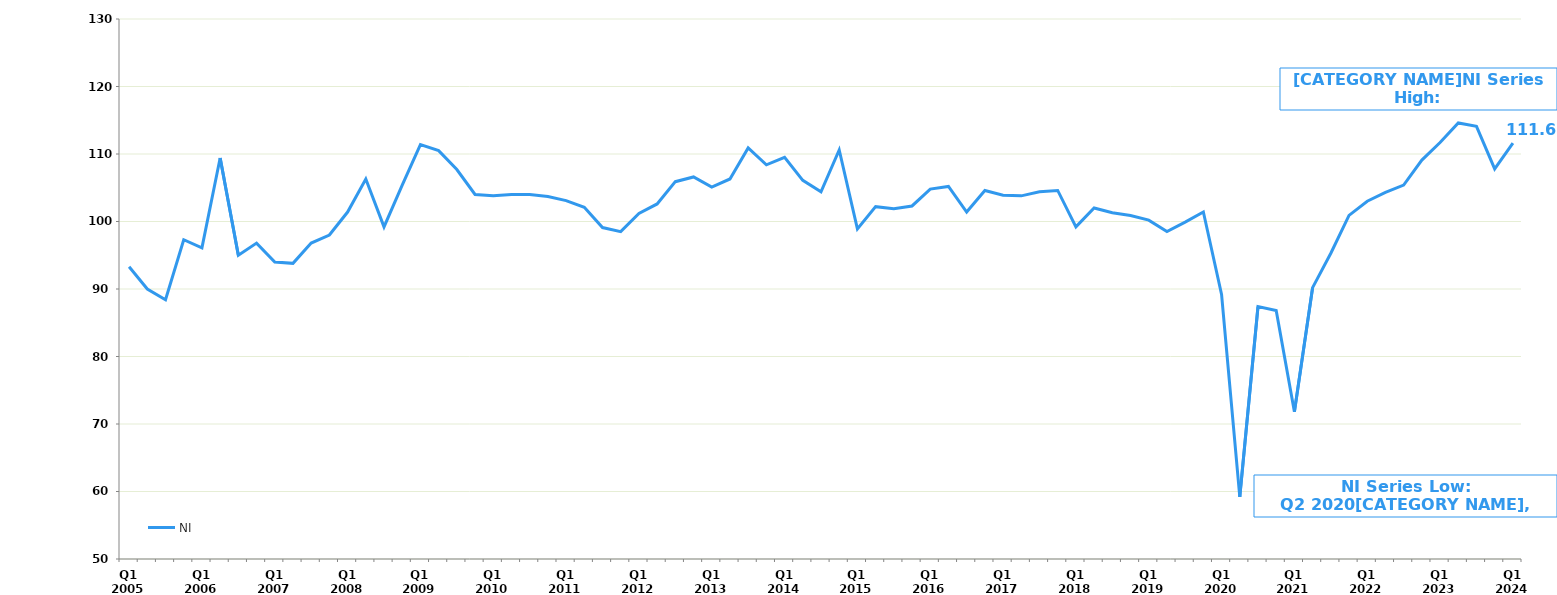
| Category | NI |
|---|---|
| Q1 2005 | 93.3 |
|  | 90 |
|  | 88.4 |
|  | 97.3 |
| Q1 2006 | 96.1 |
|  | 109.4 |
|  | 95 |
|  | 96.8 |
| Q1 2007 | 94 |
|  | 93.8 |
|  | 96.8 |
|  | 98 |
| Q1 2008 | 101.4 |
|  | 106.3 |
|  | 99.2 |
|  | 105.4 |
| Q1 2009 | 111.4 |
|  | 110.5 |
|  | 107.7 |
|  | 104 |
| Q1 2010 | 103.8 |
|  | 104 |
|  | 104 |
|  | 103.7 |
| Q1 2011 | 103.1 |
|  | 102.1 |
|  | 99.1 |
|  | 98.5 |
| Q1 2012 | 101.2 |
|  | 102.6 |
|  | 105.9 |
|  | 106.6 |
| Q1 2013 | 105.1 |
|  | 106.3 |
|  | 110.9 |
|  | 108.4 |
| Q1 2014 | 109.5 |
|  | 106.1 |
|  | 104.4 |
|  | 110.6 |
| Q1 2015 | 98.9 |
|  | 102.2 |
|  | 101.9 |
|  | 102.3 |
| Q1 2016 | 104.8 |
|  | 105.2 |
|  | 101.4 |
|  | 104.6 |
| Q1 2017 | 103.9 |
|  | 103.8 |
|  | 104.4 |
|  | 104.6 |
| Q1 2018 | 99.2 |
|  | 102 |
|  | 101.3 |
|  | 100.9 |
| Q1 2019 | 100.2 |
|  | 98.5 |
|  | 99.9 |
|  | 101.4 |
| Q1 2020 | 89.2 |
|  | 59.2 |
|  | 87.4 |
|  | 86.8 |
| Q1 2021 | 71.8 |
|  | 90.2 |
|  | 95.3 |
|  | 100.9 |
| Q1 2022 | 103 |
|  | 104.3 |
|  | 105.4 |
|  | 109.1 |
| Q1 2023 | 111.7 |
|  | 114.6 |
|  | 114.1 |
|  | 107.8 |
| Q1 2024 | 111.6 |